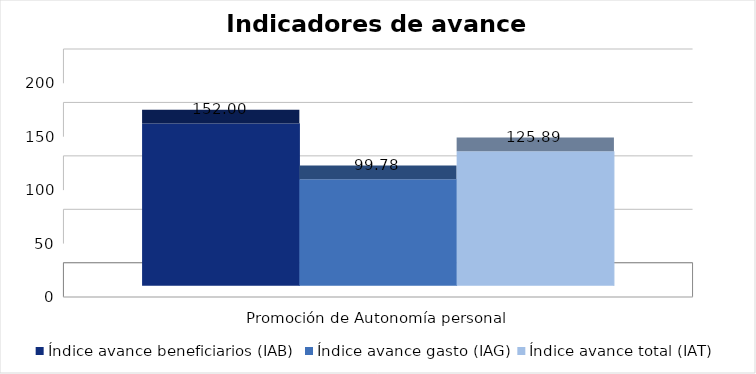
| Category | Índice avance beneficiarios (IAB)  | Índice avance gasto (IAG) | Índice avance total (IAT)  |
|---|---|---|---|
| Promoción de Autonomía personal  | 152 | 99.78 | 125.89 |